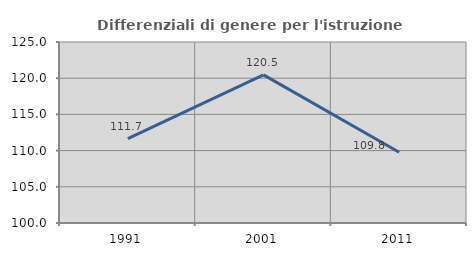
| Category | Differenziali di genere per l'istruzione superiore |
|---|---|
| 1991.0 | 111.666 |
| 2001.0 | 120.463 |
| 2011.0 | 109.765 |